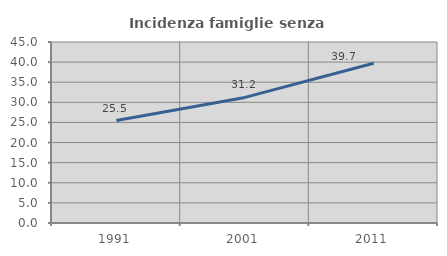
| Category | Incidenza famiglie senza nuclei |
|---|---|
| 1991.0 | 25.47 |
| 2001.0 | 31.227 |
| 2011.0 | 39.714 |